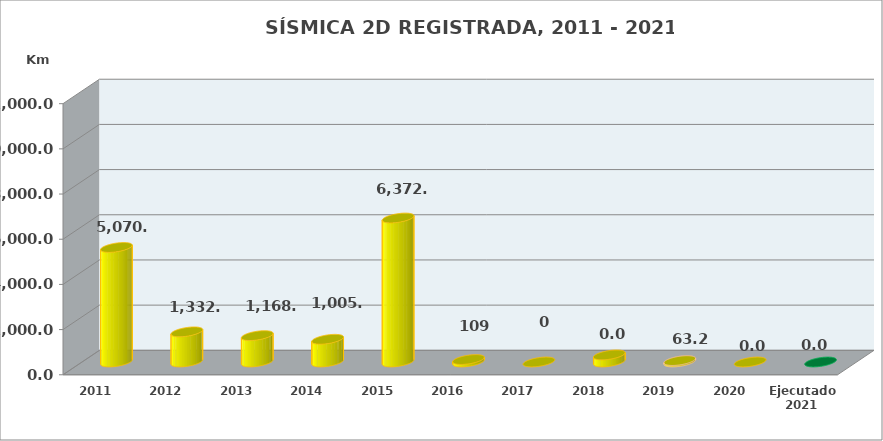
| Category | Series 0 |
|---|---|
| 2011 | 5070.18 |
| 2012 | 1332.85 |
| 2013 | 1168 |
| 2014 | 1005.3 |
| 2015 | 6372.61 |
| 2016 | 108.95 |
| 2017 | 0 |
| 2018 | 313.4 |
| 2019 | 63.22 |
| 2020 | 0 |
| Ejecutado 2021 | 0 |